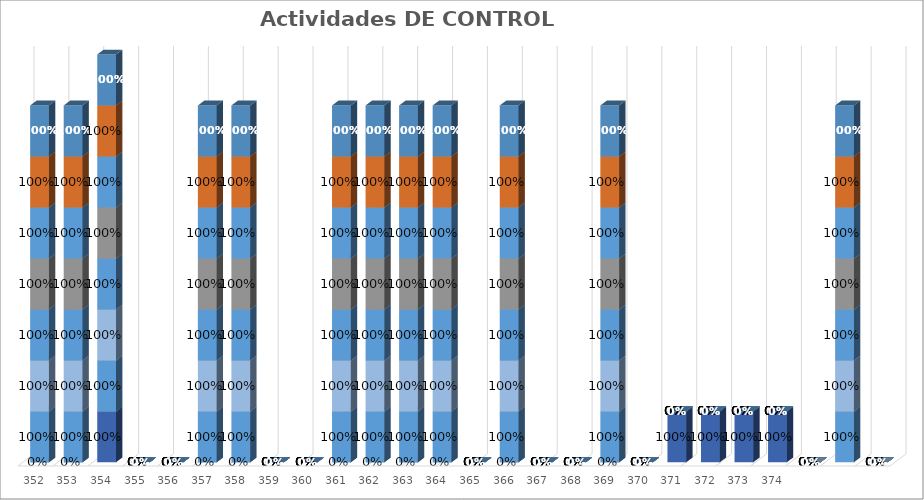
| Category | % Avance |
|---|---|
| 352.0 | 1 |
| 353.0 | 1 |
| 354.0 | 1 |
| 355.0 | 0 |
| 356.0 | 0 |
| 357.0 | 1 |
| 358.0 | 1 |
| 359.0 | 0 |
| 360.0 | 0 |
| 361.0 | 1 |
| 362.0 | 1 |
| 363.0 | 1 |
| 364.0 | 1 |
| 365.0 | 0 |
| 366.0 | 1 |
| 367.0 | 0 |
| 368.0 | 0 |
| 369.0 | 1 |
| 370.0 | 0 |
| 371.0 | 0 |
| 372.0 | 0 |
| 373.0 | 0 |
| 374.0 | 0 |